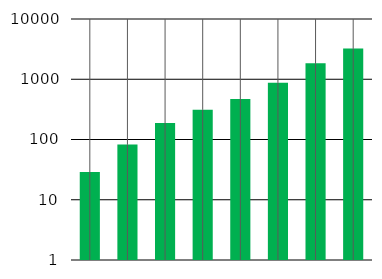
| Category | Series 0 |
|---|---|
| 0 | 28.802 |
| 1 | 82.848 |
| 2 | 187.091 |
| 3 | 312.255 |
| 4 | 469.726 |
| 5 | 878.513 |
| 6 | 1839.065 |
| 7 | 3237.76 |